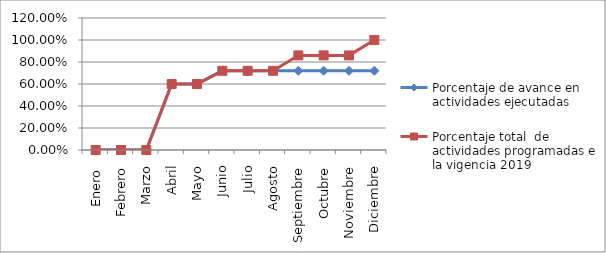
| Category | Porcentaje de avance en actividades ejecutadas | Porcentaje total  de actividades programadas en la vigencia 2019 |
|---|---|---|
| Enero  | 0 | 0 |
| Febrero | 0 | 0 |
| Marzo | 0 | 0 |
| Abril | 0.6 | 0.6 |
| Mayo | 0.6 | 0.6 |
| Junio | 0.72 | 0.72 |
| Julio | 0.72 | 0.72 |
| Agosto | 0.72 | 0.72 |
| Septiembre | 0.72 | 0.86 |
| Octubre | 0.72 | 0.86 |
| Noviembre | 0.72 | 0.86 |
| Diciembre | 0.72 | 1 |